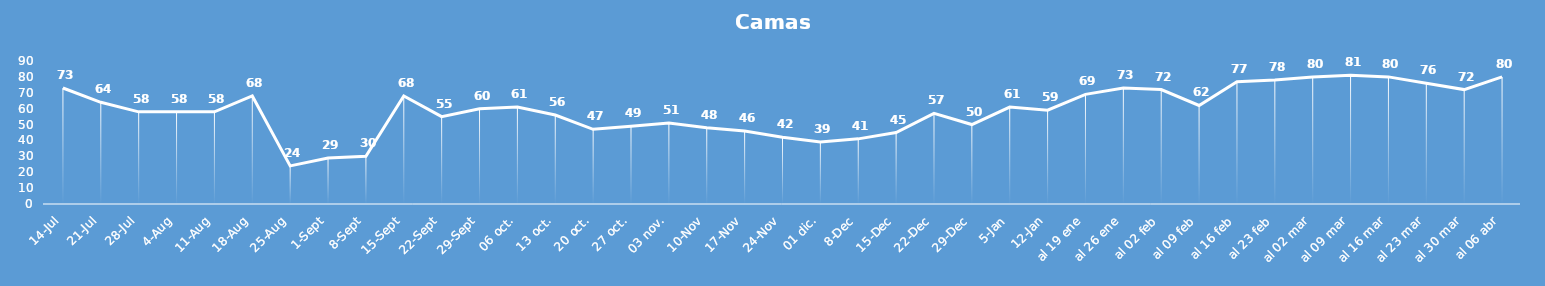
| Category | Series 0 |
|---|---|
| 14-Jul | 73 |
| 21-Jul | 64 |
| 28-Jul | 58 |
| 4-Ago | 58 |
| 11-Ago | 58 |
| 18-Ago | 68 |
| 25-Ago | 24 |
| 1-Set | 29 |
| 8-Set | 30 |
| 15-Set | 68 |
| 22-Set | 55 |
| 29-Set | 60 |
| 06 oct. | 61 |
| 13 oct. | 56 |
| 20 oct. | 47 |
| 27 oct. | 49 |
| 03 nov. | 51 |
| 10-Nov | 48 |
| 17-Nov | 46 |
| 24-Nov | 42 |
|  01 dic. | 39 |
| 8-Dic | 41 |
| 15-Dic | 45 |
| 22-Dic | 57 |
| 29-Dic | 50 |
| 5-Ene | 61 |
| 12-Ene | 59 |
| al 19 ene | 69 |
| al 26 ene | 73 |
| al 02 feb | 72 |
| al 09 feb | 62 |
| al 16 feb | 77 |
| al 23 feb | 78 |
| al 02 mar | 80 |
| al 09 mar | 81 |
| al 16 mar | 80 |
| al 23 mar | 76 |
| al 30 mar | 72 |
| al 06 abr | 80 |